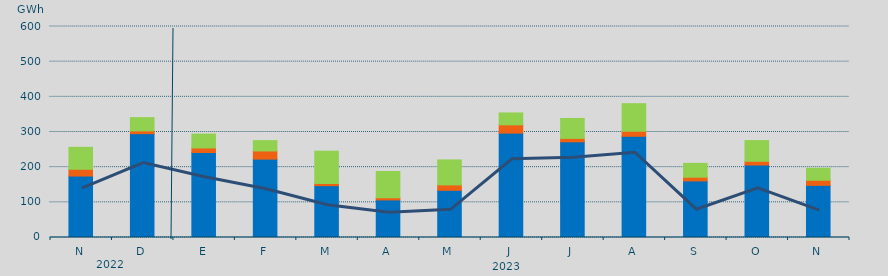
| Category | Asignación SEPE | Asignación Francia | Asignación Portugal |
|---|---|---|---|
| N | 174742.7 | 19231.9 | 62469.6 |
| D | 295334.825 | 7715.1 | 37807.2 |
| E | 241649.025 | 13030.5 | 39359.9 |
| F | 222841.2 | 23234.4 | 29375.8 |
| M | 147441.275 | 6126.3 | 91808.3 |
| A | 106835.5 | 6210.9 | 74632.6 |
| M | 134157.925 | 15418.6 | 70990 |
| J | 296773.85 | 23610.9 | 33804.6 |
| J | 272106 | 9754 | 56632.6 |
| A | 287813.1 | 14419.4 | 78281 |
| S | 160873.1 | 10544 | 39388.9 |
| O | 206141.775 | 10508.8 | 58942.5 |
| N | 148282.275 | 14554.1 | 34048.3 |